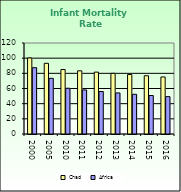
| Category | Chad | Africa |
|---|---|---|
| 2000.0 | 100.3 | 87.462 |
| 2005.0 | 93.2 | 73.418 |
| 2010.0 | 85 | 60.345 |
| 2011.0 | 83.3 | 58.107 |
| 2012.0 | 81.6 | 56.032 |
| 2013.0 | 80 | 54.131 |
| 2014.0 | 78.4 | 52.336 |
| 2015.0 | 76.8 | 50.754 |
| 2016.0 | 75.2 | 49.283 |